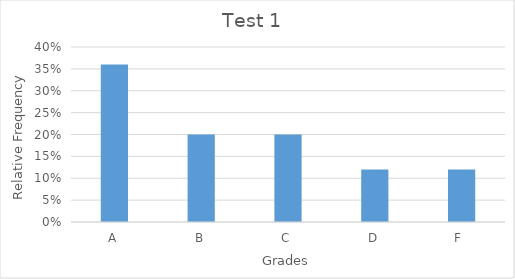
| Category | Perecent |
|---|---|
| A | 0.36 |
| B | 0.2 |
| C | 0.2 |
| D | 0.12 |
| F  | 0.12 |